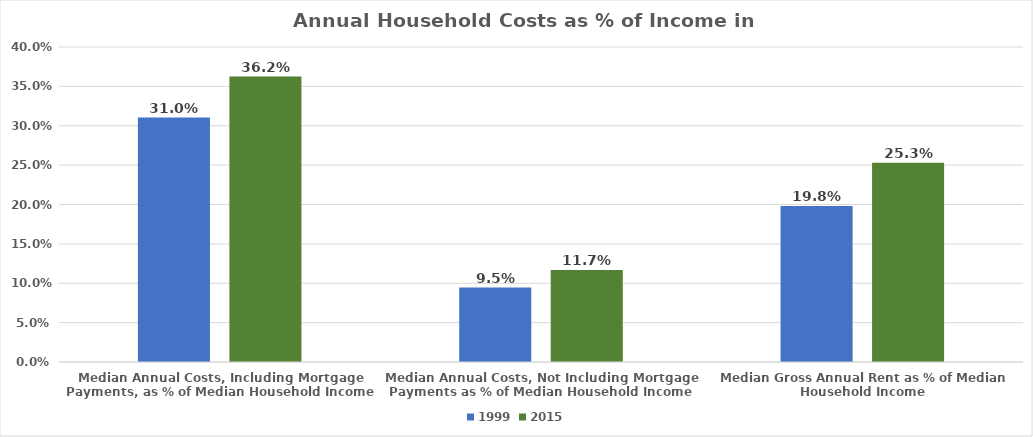
| Category | 1999 | 2015 |
|---|---|---|
| Median Annual Costs, Including Mortgage Payments, as % of Median Household Income | 0.31 | 0.362 |
| Median Annual Costs, Not Including Mortgage Payments as % of Median Household Income | 0.095 | 0.117 |
| Median Gross Annual Rent as % of Median Household Income | 0.198 | 0.253 |